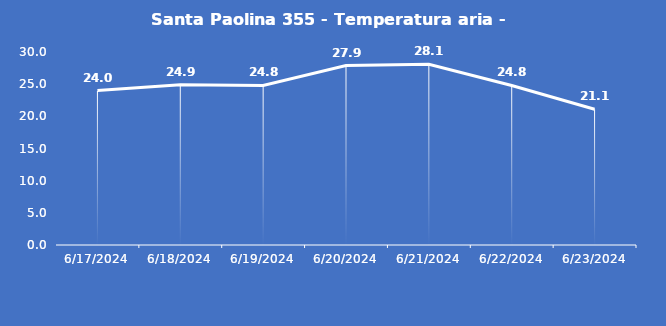
| Category | Santa Paolina 355 - Temperatura aria - Grezzo (°C) |
|---|---|
| 6/17/24 | 24 |
| 6/18/24 | 24.9 |
| 6/19/24 | 24.8 |
| 6/20/24 | 27.9 |
| 6/21/24 | 28.1 |
| 6/22/24 | 24.8 |
| 6/23/24 | 21.1 |